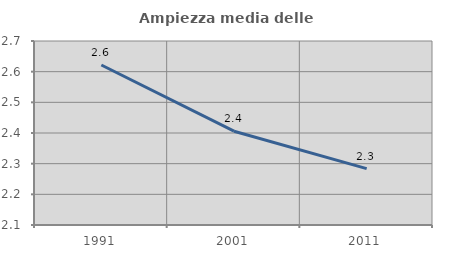
| Category | Ampiezza media delle famiglie |
|---|---|
| 1991.0 | 2.622 |
| 2001.0 | 2.406 |
| 2011.0 | 2.284 |